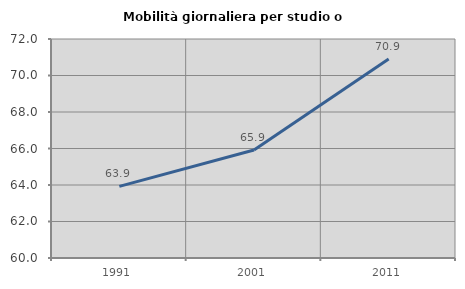
| Category | Mobilità giornaliera per studio o lavoro |
|---|---|
| 1991.0 | 63.927 |
| 2001.0 | 65.92 |
| 2011.0 | 70.904 |